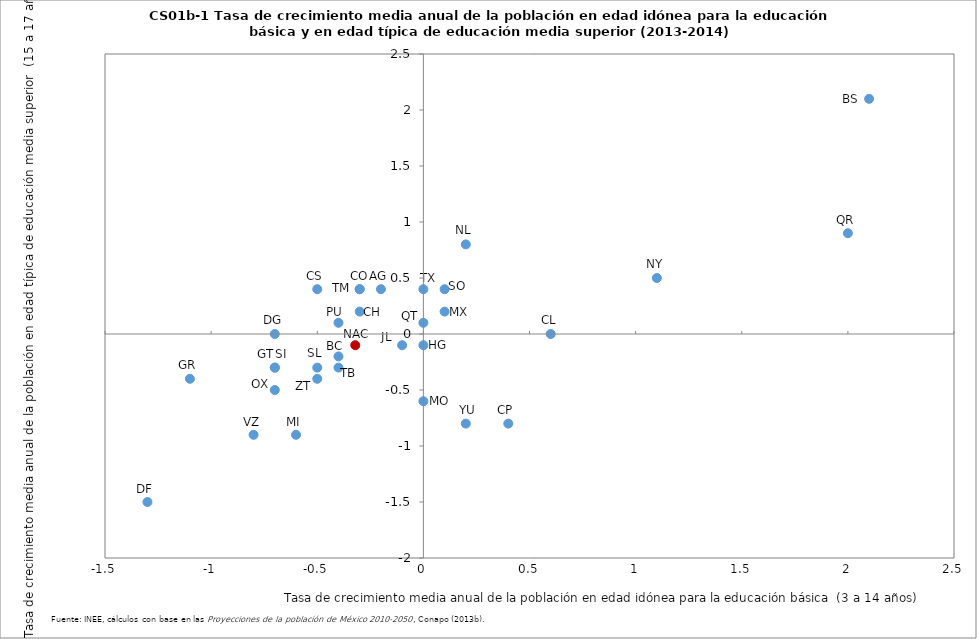
| Category | Series 0 |
|---|---|
| -0.2 | 0.4 |
| -0.4 | -0.3 |
| 2.1 | 2.1 |
| 0.4 | -0.8 |
| -0.3 | 0.4 |
| 0.6 | 0 |
| -0.5 | 0.4 |
| -0.3 | 0.2 |
| -1.3 | -1.5 |
| -0.7 | 0 |
| -0.7 | -0.3 |
| -1.1 | -0.4 |
| 0.0 | -0.1 |
| -0.1 | -0.1 |
| 0.1 | 0.2 |
| -0.6 | -0.9 |
| 0.0 | -0.6 |
| 1.1 | 0.5 |
| 0.2 | 0.8 |
| -0.7 | -0.5 |
| -0.4 | 0.1 |
| 0.0 | 0.1 |
| 2.0 | 0.9 |
| -0.5 | -0.3 |
| -0.7 | -0.3 |
| 0.1 | 0.4 |
| -0.4 | -0.2 |
| -0.3 | 0.4 |
| 0.0 | 0.4 |
| -0.8 | -0.9 |
| 0.2 | -0.8 |
| -0.5 | -0.4 |
| -0.32088 | -0.1 |